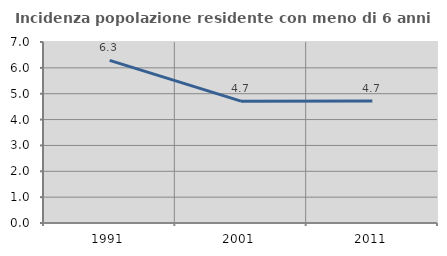
| Category | Incidenza popolazione residente con meno di 6 anni |
|---|---|
| 1991.0 | 6.289 |
| 2001.0 | 4.712 |
| 2011.0 | 4.723 |